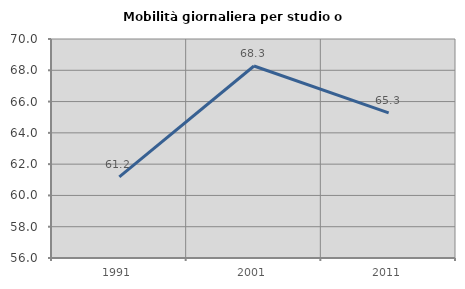
| Category | Mobilità giornaliera per studio o lavoro |
|---|---|
| 1991.0 | 61.184 |
| 2001.0 | 68.276 |
| 2011.0 | 65.278 |